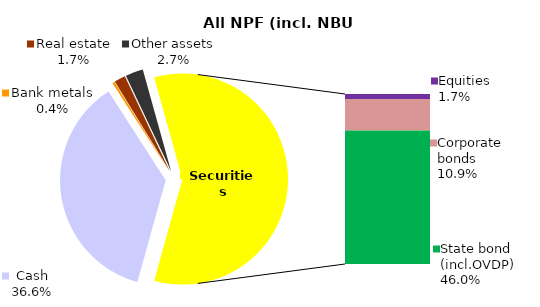
| Category | All NPF (incl. NBU CNPF)* |
|---|---|
| Cash | 1004 |
| Bank metals | 9.8 |
| Real estate | 47.3 |
| Other assets | 74.5 |
| Equities | 47.5 |
| Corporate bonds | 298.6 |
| Municipal bonds | 0 |
| State bond (incl.OVDP) | 1263.5 |